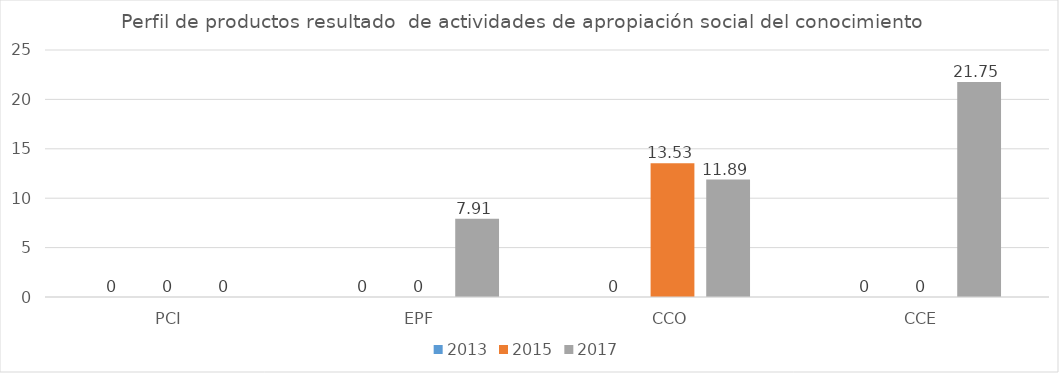
| Category | 2013 | 2015 | 2017 |
|---|---|---|---|
| PCI | 0 | 0 | 0 |
| EPF | 0 | 0 | 7.91 |
| CCO | 0 | 13.53 | 11.89 |
| CCE | 0 | 0 | 21.75 |